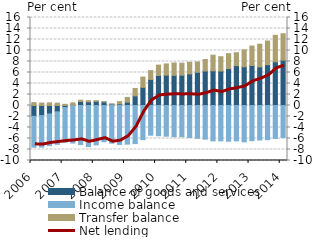
| Category | Balance of goods and services | Income balance | Transfer balance |
|---|---|---|---|
| 2006.0 | -1.964 | -5.619 | 0.527 |
| 2006.0 | -1.833 | -5.726 | 0.449 |
| 2006.0 | -1.541 | -5.753 | 0.482 |
| 2006.0 | -1.152 | -5.908 | 0.424 |
| 2007.0 | -0.358 | -6.317 | 0.214 |
| 2007.0 | 0.077 | -6.83 | 0.397 |
| 2007.0 | 0.732 | -7.114 | 0.227 |
| 2007.0 | 0.66 | -7.469 | 0.208 |
| 2008.0 | 0.742 | -7.161 | 0.139 |
| 2008.0 | 0.638 | -6.581 | 0.007 |
| 2008.0 | 0.236 | -6.846 | 0.033 |
| 2008.0 | 0.292 | -7.077 | 0.413 |
| 2009.0 | 0.614 | -7.024 | 0.857 |
| 2009.0 | 1.746 | -6.925 | 1.354 |
| 2009.0 | 3.3 | -6.22 | 1.873 |
| 2009.0 | 4.732 | -5.396 | 1.614 |
| 2010.0 | 5.463 | -5.502 | 1.88 |
| 2010.0 | 5.52 | -5.584 | 2.034 |
| 2010.0 | 5.479 | -5.676 | 2.255 |
| 2010.0 | 5.504 | -5.679 | 2.187 |
| 2011.0 | 5.749 | -5.812 | 2.109 |
| 2011.0 | 6.036 | -5.961 | 1.879 |
| 2011.0 | 6.272 | -6.121 | 2.092 |
| 2011.0 | 6.309 | -6.437 | 2.842 |
| 2012.0 | 6.265 | -6.424 | 2.604 |
| 2012.0 | 6.713 | -6.499 | 2.709 |
| 2012.0 | 7.252 | -6.433 | 2.349 |
| 2012.0 | 7.044 | -6.606 | 3.07 |
| 2013.0 | 7.267 | -6.402 | 3.549 |
| 2013.0 | 7.023 | -6.28 | 4.123 |
| 2013.0 | 7.42 | -6.217 | 4.303 |
| 2013.0 | 7.944 | -5.994 | 4.816 |
| 2014.0 | 8.236 | -5.815 | 4.812 |